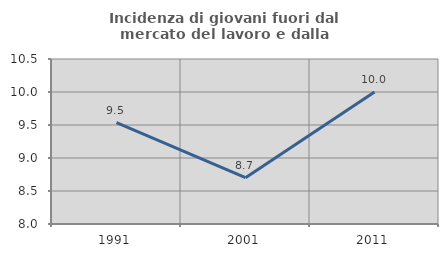
| Category | Incidenza di giovani fuori dal mercato del lavoro e dalla formazione  |
|---|---|
| 1991.0 | 9.534 |
| 2001.0 | 8.701 |
| 2011.0 | 10 |